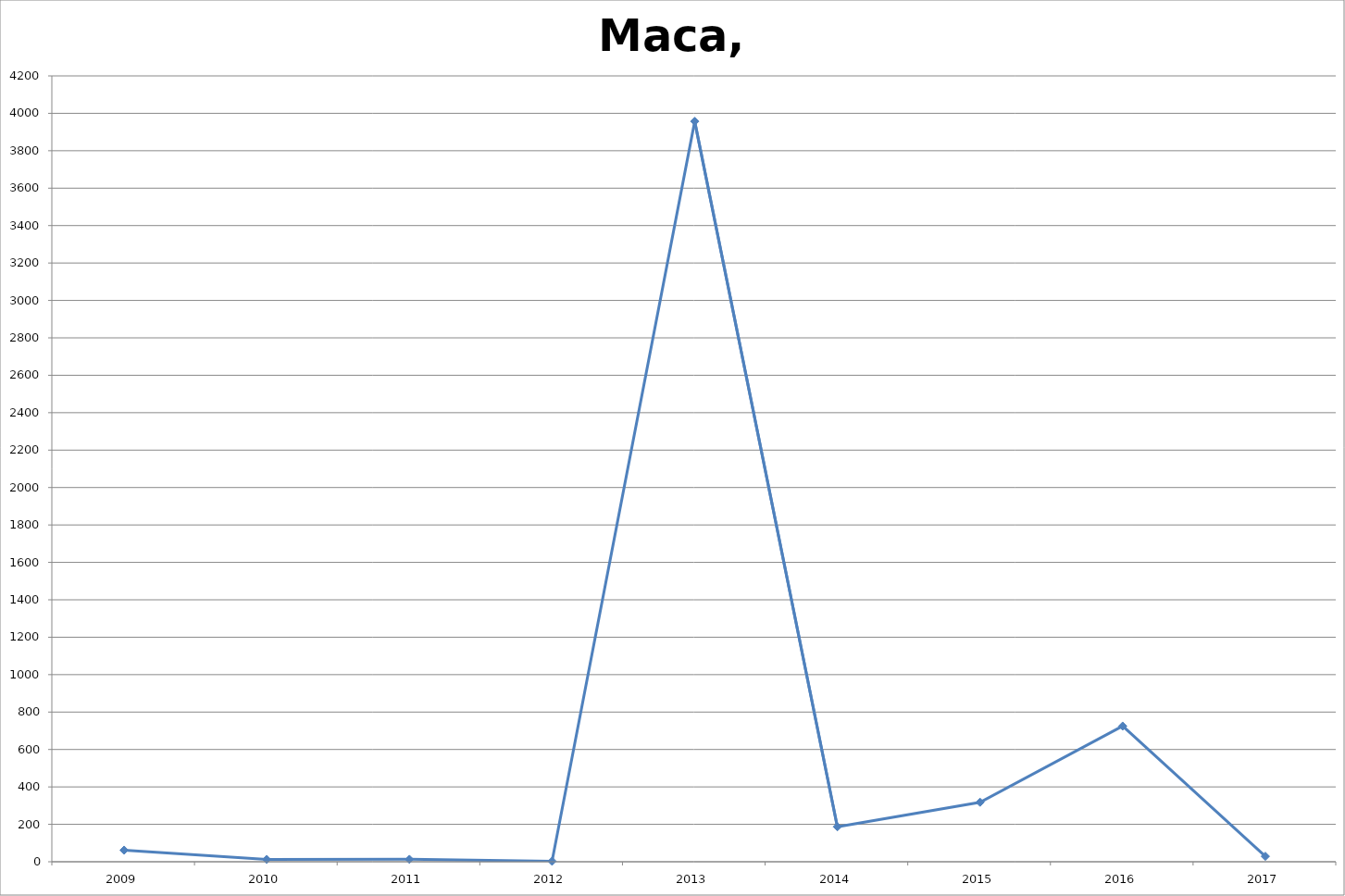
| Category | Маса, м3 |
|---|---|
| 2009.0 | 62 |
| 2010.0 | 12.6 |
| 2011.0 | 13 |
| 2012.0 | 3 |
| 2013.0 | 3957 |
| 2014.0 | 187 |
| 2015.0 | 318 |
| 2016.0 | 725 |
| 2017.0 | 29 |